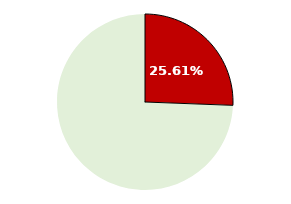
| Category | Series 0 |
|---|---|
| IRPEF | 8450 |
| IMPONIBILE | 24550 |